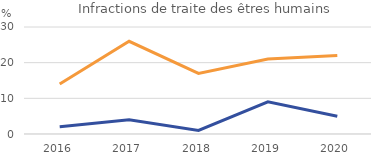
| Category | Part des victimes mineures française | Part des victimes mineures |
|---|---|---|
| 2016.0 | 2 | 14 |
| 2017.0 | 4 | 26 |
| 2018.0 | 1 | 17 |
| 2019.0 | 9 | 21 |
| 2020.0 | 5 | 22 |